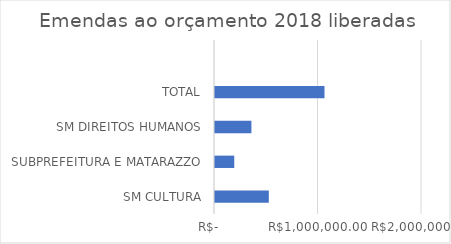
| Category | Series 0 |
|---|---|
| SM CULTURA | 520000 |
| SUBPREFEITURA E MATARAZZO | 186019 |
| SM DIREITOS HUMANOS | 351849 |
| TOTAL | 1057868 |